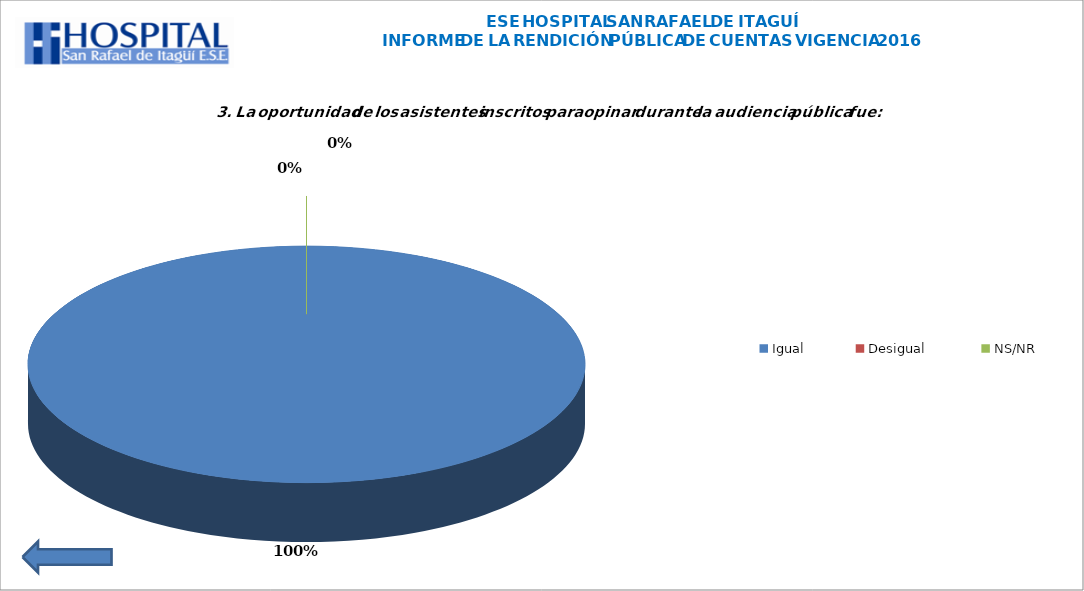
| Category | Series 0 |
|---|---|
| Igual | 43 |
| Desigual  | 0 |
| NS/NR | 0 |